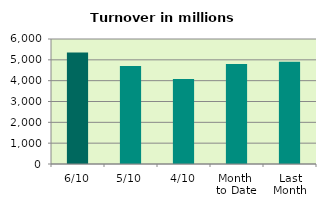
| Category | Series 0 |
|---|---|
| 6/10 | 5346.746 |
| 5/10 | 4698.776 |
| 4/10 | 4085.167 |
| Month 
to Date | 4799.045 |
| Last
Month | 4910.879 |